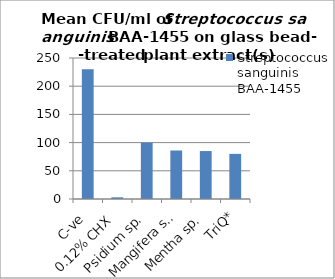
| Category | Streptococcus sanguinis BAA-1455 |
|---|---|
| C-ve | 230 |
| 0.12% CHX | 3 |
| Psidium sp. | 100 |
| Mangifera sp. | 86 |
| Mentha sp. | 85 |
| TriQ* | 80 |